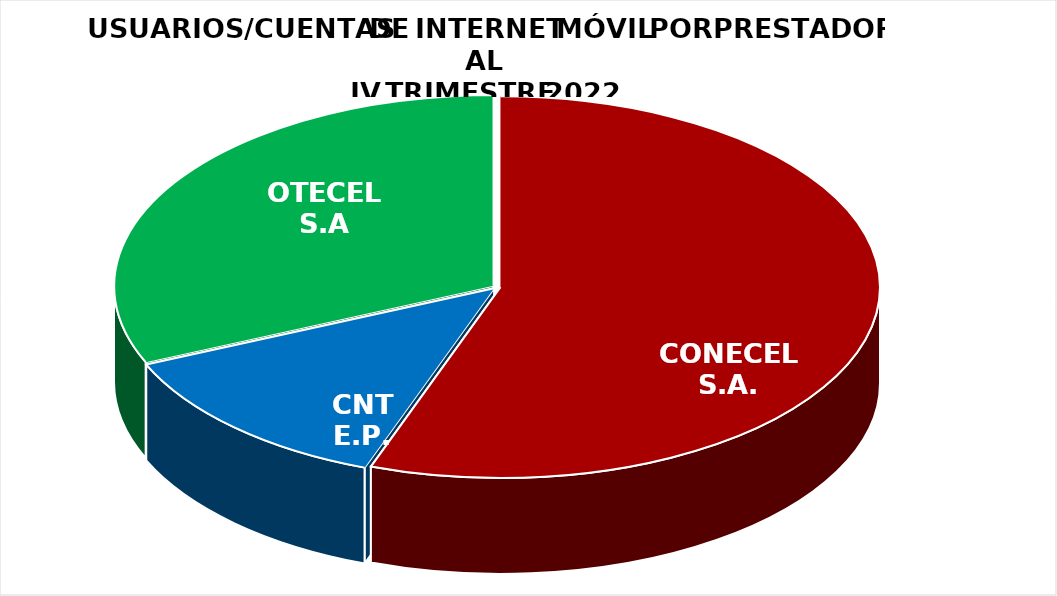
| Category | Series 0 |
|---|---|
| CONECEL S.A. | 5941655 |
| CNT E.P. | 1380771 |
| OTECEL S.A | 3374766.705 |